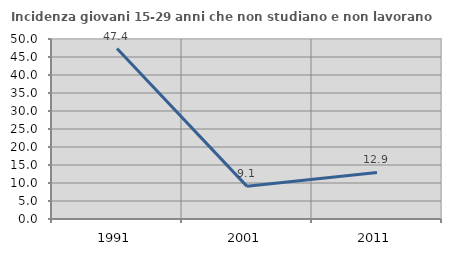
| Category | Incidenza giovani 15-29 anni che non studiano e non lavorano  |
|---|---|
| 1991.0 | 47.358 |
| 2001.0 | 9.068 |
| 2011.0 | 12.933 |